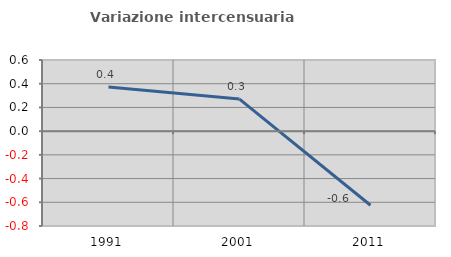
| Category | Variazione intercensuaria annua |
|---|---|
| 1991.0 | 0.373 |
| 2001.0 | 0.271 |
| 2011.0 | -0.625 |